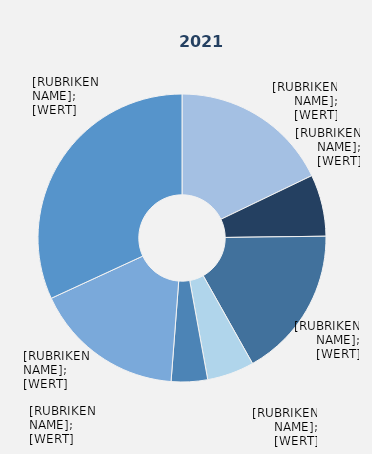
| Category | Series 1 |
|---|---|
| Produzierendes Gewerbe ohne Baugewerbe | 0.179 |
| Baugewerbe | 0.069 |
| Handel | 0.171 |
| Verkehr und Lagerei | 0.053 |
| Gastgewerbe | 0.041 |
| Erbringung von Unternehmens-dienstleistungen | 0.169 |
| Erbringung von öffentlichen und privaten Dienstleistungen | 0.319 |